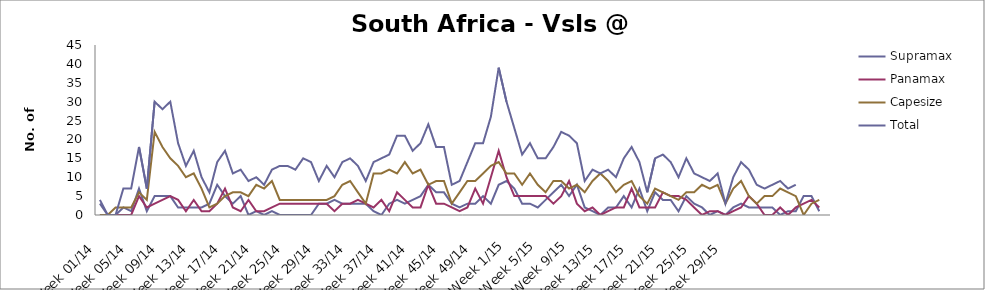
| Category | Supramax | Panamax | Capesize | Total |
|---|---|---|---|---|
| Week 01/14 | 3 | 0 | 0 | 4 |
| Week 02/14 | 0 | 0 | 0 | 0 |
| Week 03/14 | 0 | 0 | 2 | 0 |
| Week 04/14 | 2 | 0 | 2 | 7 |
| Week 05/14 | 1 | 0 | 2 | 7 |
| Week 06/14 | 7 | 5 | 6 | 18 |
| Week 07/14 | 1 | 2 | 4 | 7 |
| Week 08/14 | 5 | 3 | 22 | 30 |
| Week 09/14 | 5 | 4 | 18 | 28 |
| Week 10/14 | 5 | 5 | 15 | 30 |
| Week 11/14 | 2 | 4 | 13 | 19 |
| Week 12/14 | 2 | 1 | 10 | 13 |
| Week 13/14 | 2 | 4 | 11 | 17 |
| Week 14/14 | 2 | 1 | 7 | 10 |
| Week 15/14 | 3 | 1 | 2 | 6 |
| Week 16/14 | 8 | 3 | 3 | 14 |
| Week 17/14 | 5 | 7 | 5 | 17 |
| Week 18/14 | 3 | 2 | 6 | 11 |
| Week 19/14 | 5 | 1 | 6 | 12 |
| Week 20/14 | 0 | 4 | 5 | 9 |
| Week 21/14 | 1 | 1 | 8 | 10 |
| Week 22/14 | 0 | 1 | 7 | 8 |
| Week 23/14 | 1 | 2 | 9 | 12 |
| Week 24/14 | 0 | 3 | 4 | 13 |
| Week 25/14 | 0 | 3 | 4 | 13 |
| Week 26/14 | 0 | 3 | 4 | 12 |
| Week 27/14 | 0 | 3 | 4 | 15 |
| Week 28/14 | 0 | 3 | 4 | 14 |
| Week 29/14 | 3 | 3 | 4 | 9 |
| Week 30/14 | 3 | 3 | 4 | 13 |
| Week 31/14 | 4 | 1 | 5 | 10 |
| Week 32/14 | 3 | 3 | 8 | 14 |
| Week 33/14 | 3 | 3 | 9 | 15 |
| Week 34/14 | 3 | 4 | 6 | 13 |
| Week 35/14 | 3 | 3 | 3 | 9 |
| Week 36/14 | 1 | 2 | 11 | 14 |
| Week 37/14 | 0 | 4 | 11 | 15 |
| Week 38/14 | 3 | 1 | 12 | 16 |
| Week 39/14 | 4 | 6 | 11 | 21 |
| Week 40/14 | 3 | 4 | 14 | 21 |
| Week 41/14 | 4 | 2 | 11 | 17 |
| Week 42/14 | 5 | 2 | 12 | 19 |
| Week 43/14 | 8 | 8 | 8 | 24 |
| Week 44/14 | 6 | 3 | 9 | 18 |
| Week 45/14 | 6 | 3 | 9 | 18 |
| Week 46/14 | 3 | 2 | 3 | 8 |
| Week 47/14 | 2 | 1 | 6 | 9 |
| Week 48/14 | 3 | 2 | 9 | 14 |
| Week 49/14 | 3 | 7 | 9 | 19 |
| Week 50/14 | 5 | 3 | 11 | 19 |
| Week 51/14 | 3 | 10 | 13 | 26 |
| Week 52/14 | 8 | 17 | 14 | 39 |
| Week 1/15 | 9 | 10 | 11 | 30 |
| Week 2/15 | 7 | 5 | 11 | 23 |
| Week 3/15 | 3 | 5 | 8 | 16 |
| Week 4/15 | 3 | 5 | 11 | 19 |
| Week 5/15 | 2 | 5 | 8 | 15 |
| Week 6/15 | 4 | 5 | 6 | 15 |
| Week 7/15 | 6 | 3 | 9 | 18 |
| Week 8/15 | 8 | 5 | 9 | 22 |
| Week 9/15 | 5 | 9 | 7 | 21 |
| Week 10/15 | 8 | 3 | 8 | 19 |
| Week 11/15 | 2 | 1 | 6 | 9 |
| Week 12/15 | 1 | 2 | 9 | 12 |
| Week 13/15 | 0 | 0 | 11 | 11 |
| Week 14/15 | 2 | 1 | 9 | 12 |
| Week 15/15 | 2 | 2 | 6 | 10 |
| Week 16/15 | 5 | 2 | 8 | 15 |
| Week 17/15 | 2 | 7 | 9 | 18 |
| Week 18/15 | 7 | 2 | 5 | 14 |
| Week 19/15 | 1 | 2 | 3 | 6 |
| Week 20/15 | 6 | 2 | 7 | 15 |
| Week 21/15 | 4 | 6 | 6 | 16 |
| Week 22/15 | 4 | 5 | 5 | 14 |
| Week 23/15 | 1 | 5 | 4 | 10 |
| Week 24/15 | 5 | 4 | 6 | 15 |
| Week 25/15 | 3 | 2 | 6 | 11 |
| Week 26/15 | 2 | 0 | 8 | 10 |
| Week 27/15 | 0 | 1 | 7 | 9 |
| Week 28/15 | 1 | 1 | 8 | 11 |
| Week 29/15 | 0 | 0 | 3 | 3 |
| Week 30/15 | 2 | 1 | 7 | 10 |
| Week 31/15 | 3 | 2 | 9 | 14 |